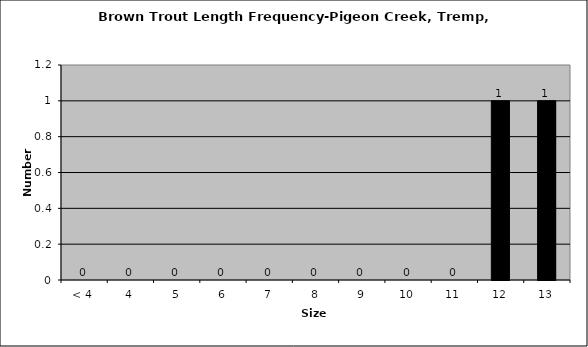
| Category | Series 0 |
|---|---|
| < 4 | 0 |
| 4 | 0 |
| 5 | 0 |
| 6 | 0 |
| 7 | 0 |
| 8 | 0 |
| 9 | 0 |
| 10 | 0 |
| 11 | 0 |
| 12 | 1 |
| 13 | 1 |